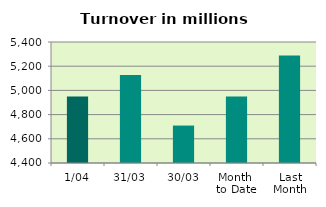
| Category | Series 0 |
|---|---|
| 1/04 | 4948.635 |
| 31/03 | 5126.625 |
| 30/03 | 4709.459 |
| Month 
to Date | 4948.635 |
| Last
Month | 5289.077 |